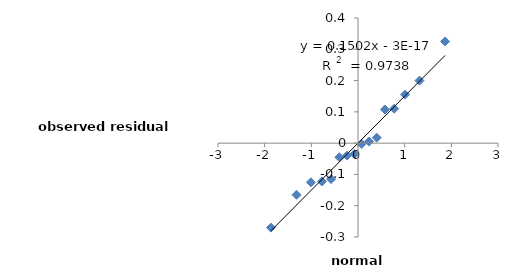
| Category | ei |
|---|---|
| -1.8657648402099227 | -0.27 |
| -1.3178098407415364 | -0.165 |
| -1.0082783038771823 | -0.125 |
| -0.7742700563543125 | -0.122 |
| -0.5770936697192589 | -0.115 |
| -0.4006301257381869 | -0.045 |
| -0.23617194000999964 | -0.04 |
| -0.07805996636699838 | -0.035 |
| 0.07805996636699838 | -0.002 |
| 0.23617194000999964 | 0.005 |
| 0.4006301257381869 | 0.018 |
| 0.5770936697192589 | 0.108 |
| 0.7742700563543125 | 0.11 |
| 1.0082783038771823 | 0.155 |
| 1.3178098407415364 | 0.2 |
| 1.8657648402099227 | 0.325 |